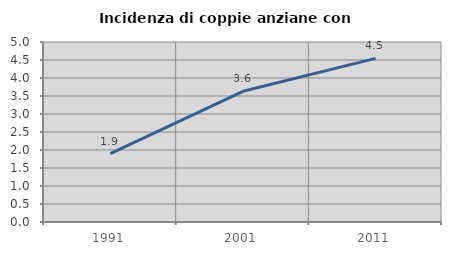
| Category | Incidenza di coppie anziane con figli |
|---|---|
| 1991.0 | 1.898 |
| 2001.0 | 3.631 |
| 2011.0 | 4.545 |